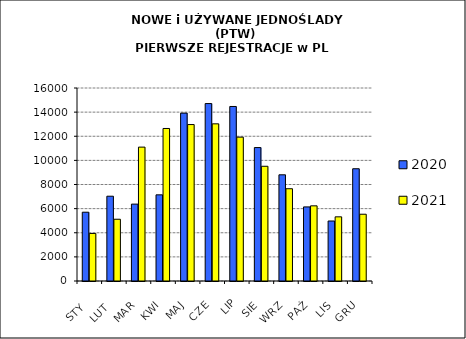
| Category | 2020 | 2021 |
|---|---|---|
|  STY  | 5703 | 3942 |
|  LUT  | 7029 | 5120 |
| MAR | 6374 | 11099 |
| KWI | 7143 | 12644 |
| MAJ | 13918 | 12970 |
| CZE | 14709 | 13029 |
| LIP | 14468 | 11926 |
| SIE | 11062 | 9511 |
| WRZ | 8804 | 7650 |
| PAŹ | 6142 | 6231 |
| LIS | 4973 | 5319 |
| GRU | 9306 | 5536 |